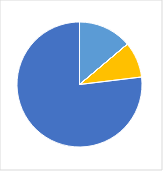
| Category | Series 0 |
|---|---|
| 0 | 0.13 |
| 1 | 0 |
| 2 | 0 |
| 3 | 0.087 |
| 4 | 0.725 |